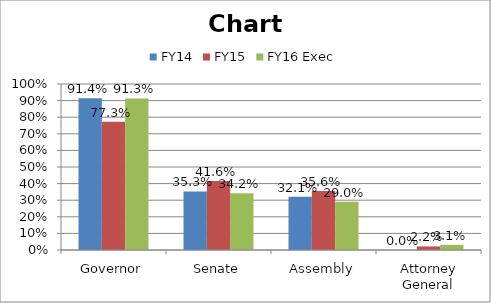
| Category | FY14 | FY15 | FY16 Exec |
|---|---|---|---|
| Governor | 0.914 | 0.773 | 0.913 |
| Senate | 0.353 | 0.416 | 0.342 |
| Assembly | 0.321 | 0.356 | 0.29 |
| Attorney General | 0 | 0.022 | 0.031 |